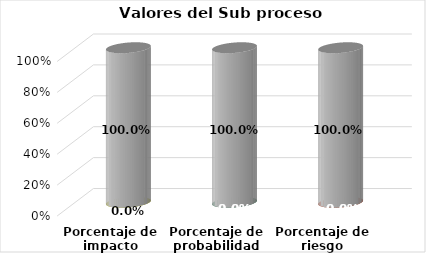
| Category | Series 0 | Series 1 |
|---|---|---|
| Porcentaje de impacto | 0 | 1 |
| Porcentaje de probabilidad | 0 | 1 |
| Porcentaje de riesgo | 0 | 1 |